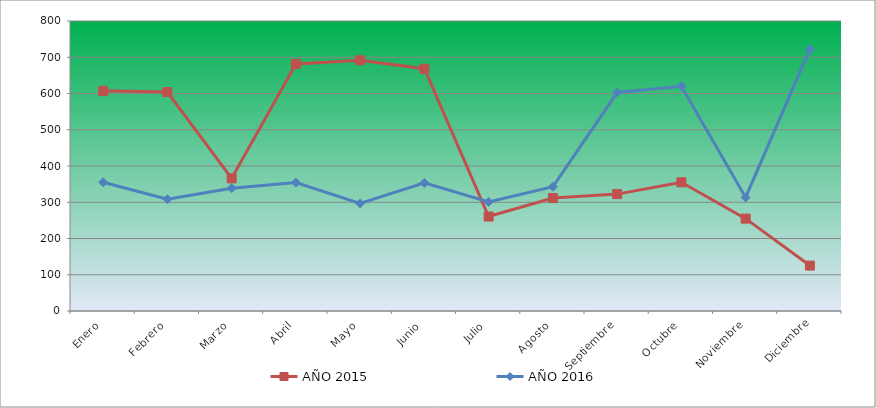
| Category | AÑO 2015 | AÑO 2016 |
|---|---|---|
| Enero | 607.301 | 355.031 |
| Febrero | 603.96 | 308.295 |
| Marzo | 365.884 | 338.632 |
| Abril | 681.648 | 354.211 |
| Mayo | 691.672 | 296.815 |
| Junio | 668.282 | 353.391 |
| Julio | 260.63 | 300.915 |
| Agosto | 311.586 | 342.732 |
| Septiembre | 322.446 | 602.65 |
| Octubre | 355.025 | 619.869 |
| Noviembre | 254.782 | 313.214 |
| Diciembre | 125.303 | 722.36 |